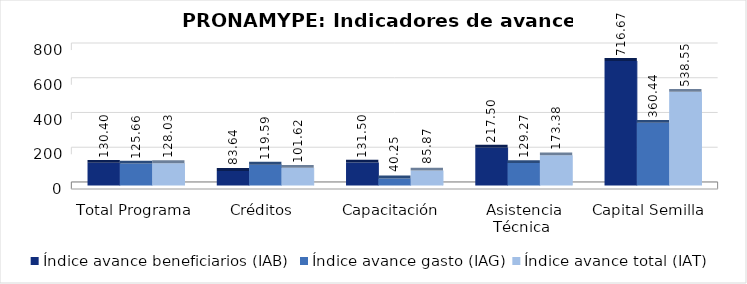
| Category | Índice avance beneficiarios (IAB)  | Índice avance gasto (IAG) | Índice avance total (IAT)  |
|---|---|---|---|
| Total Programa | 130.403 | 125.665 | 128.034 |
| Créditos  | 83.641 | 119.59 | 101.615 |
| Capacitación  | 131.5 | 40.245 | 85.873 |
| Asistencia Técnica  | 217.5 | 129.268 | 173.384 |
| Capital Semilla  | 716.667 | 360.438 | 538.552 |